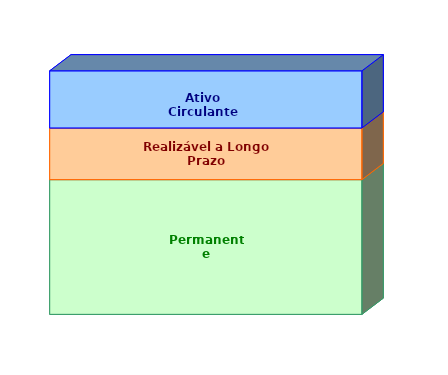
| Category | Permanente | Realizável a Longo Prazo | Ativo Circulante |
|---|---|---|---|
| 0 | 0.553 | 0.212 | 0.235 |